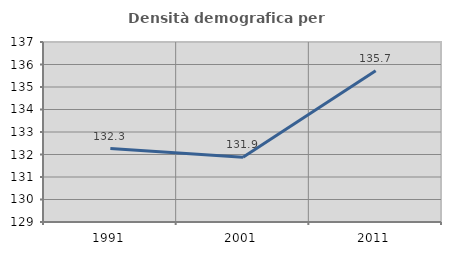
| Category | Densità demografica |
|---|---|
| 1991.0 | 132.266 |
| 2001.0 | 131.879 |
| 2011.0 | 135.721 |